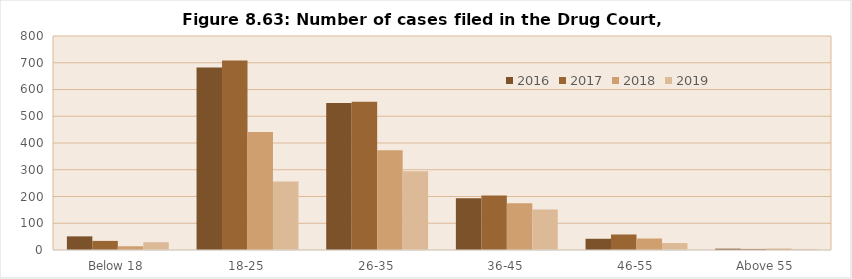
| Category | 2016 | 2017 | 2018 | 2019 |
|---|---|---|---|---|
| Below 18 | 51 | 34 | 14 | 29 |
| 18-25 | 682 | 708 | 441 | 256 |
| 26-35 | 550 | 554 | 373 | 294 |
| 36-45 | 193 | 204 | 175 | 151 |
| 46-55 | 42 | 58 | 43 | 26 |
| Above 55 | 5 | 4 | 5 | 4 |